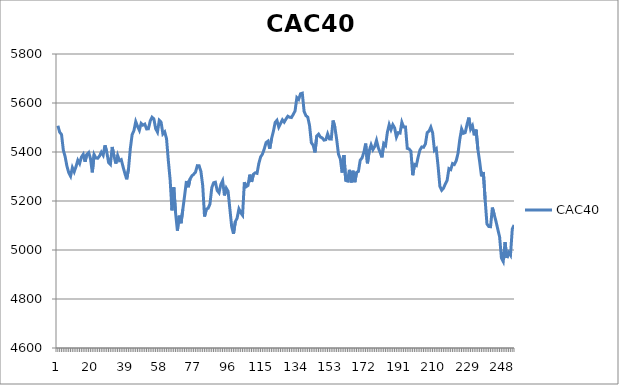
| Category | CAC40 |
|---|---|
| 0 | 5507.25 |
| 1 | 5480.64 |
| 2 | 5471.43 |
| 3 | 5407.75 |
| 4 | 5380.72 |
| 5 | 5341.63 |
| 6 | 5315.58 |
| 7 | 5301.25 |
| 8 | 5336.39 |
| 9 | 5319.17 |
| 10 | 5340.45 |
| 11 | 5366.15 |
| 12 | 5352.76 |
| 13 | 5379.54 |
| 14 | 5390.46 |
| 15 | 5360.09 |
| 16 | 5390.48 |
| 17 | 5398.05 |
| 18 | 5372.79 |
| 19 | 5316.89 |
| 20 | 5389.29 |
| 21 | 5375.53 |
| 22 | 5374.35 |
| 23 | 5383.86 |
| 24 | 5399.09 |
| 25 | 5386.83 |
| 26 | 5427.19 |
| 27 | 5399.45 |
| 28 | 5357.14 |
| 29 | 5349.3 |
| 30 | 5420.58 |
| 31 | 5382.91 |
| 32 | 5352.77 |
| 33 | 5385.97 |
| 34 | 5364.72 |
| 35 | 5368.84 |
| 36 | 5339.42 |
| 37 | 5312.56 |
| 38 | 5288.6 |
| 39 | 5331.28 |
| 40 | 5413.69 |
| 41 | 5470.75 |
| 42 | 5487.42 |
| 43 | 5523.94 |
| 44 | 5504.68 |
| 45 | 5488.55 |
| 46 | 5517.06 |
| 47 | 5509.69 |
| 48 | 5513.82 |
| 49 | 5493.99 |
| 50 | 5494.83 |
| 51 | 5526.51 |
| 52 | 5541.99 |
| 53 | 5535.26 |
| 54 | 5495.16 |
| 55 | 5481.21 |
| 56 | 5529.15 |
| 57 | 5521.59 |
| 58 | 5473.78 |
| 59 | 5481.93 |
| 60 | 5454.55 |
| 61 | 5364.98 |
| 62 | 5285.83 |
| 63 | 5161.81 |
| 64 | 5255.9 |
| 65 | 5151.68 |
| 66 | 5079.21 |
| 67 | 5140.06 |
| 68 | 5109.24 |
| 69 | 5165.26 |
| 70 | 5222.52 |
| 71 | 5281.58 |
| 72 | 5256.18 |
| 73 | 5289.86 |
| 74 | 5302.17 |
| 75 | 5309.23 |
| 76 | 5317.37 |
| 77 | 5344.26 |
| 78 | 5343.93 |
| 79 | 5320.49 |
| 80 | 5262.56 |
| 81 | 5136.58 |
| 82 | 5167.23 |
| 83 | 5170.23 |
| 84 | 5187.83 |
| 85 | 5254.1 |
| 86 | 5274.4 |
| 87 | 5276.71 |
| 88 | 5242.79 |
| 89 | 5233.36 |
| 90 | 5267.26 |
| 91 | 5282.75 |
| 92 | 5222.84 |
| 93 | 5252.43 |
| 94 | 5239.74 |
| 95 | 5167.21 |
| 96 | 5095.22 |
| 97 | 5066.28 |
| 98 | 5115.74 |
| 99 | 5130.44 |
| 100 | 5167.3 |
| 101 | 5152.12 |
| 102 | 5141.8 |
| 103 | 5276.67 |
| 104 | 5258.24 |
| 105 | 5263.39 |
| 106 | 5307.56 |
| 107 | 5277.94 |
| 108 | 5309.22 |
| 109 | 5315.02 |
| 110 | 5312.96 |
| 111 | 5353.54 |
| 112 | 5380.17 |
| 113 | 5391.64 |
| 114 | 5412.83 |
| 115 | 5438.55 |
| 116 | 5444.16 |
| 117 | 5413.3 |
| 118 | 5453.58 |
| 119 | 5483.19 |
| 120 | 5520.5 |
| 121 | 5529.22 |
| 122 | 5501.66 |
| 123 | 5516.05 |
| 124 | 5531.42 |
| 125 | 5521.93 |
| 126 | 5534.63 |
| 127 | 5545.95 |
| 128 | 5541.94 |
| 129 | 5540.68 |
| 130 | 5553.16 |
| 131 | 5567.54 |
| 132 | 5621.92 |
| 133 | 5614.51 |
| 134 | 5637.51 |
| 135 | 5640.1 |
| 136 | 5565.85 |
| 137 | 5548.45 |
| 138 | 5542.55 |
| 139 | 5508.93 |
| 140 | 5438.06 |
| 141 | 5427.35 |
| 142 | 5398.4 |
| 143 | 5465.53 |
| 144 | 5472.91 |
| 145 | 5460.95 |
| 146 | 5457.56 |
| 147 | 5448.36 |
| 148 | 5450.22 |
| 149 | 5473.91 |
| 150 | 5453.37 |
| 151 | 5452.73 |
| 152 | 5528.46 |
| 153 | 5501.88 |
| 154 | 5450.48 |
| 155 | 5390.63 |
| 156 | 5372.31 |
| 157 | 5316.01 |
| 158 | 5387.38 |
| 159 | 5283.86 |
| 160 | 5281.29 |
| 161 | 5327.2 |
| 162 | 5275.64 |
| 163 | 5323.53 |
| 164 | 5276.76 |
| 165 | 5316.77 |
| 166 | 5320.5 |
| 167 | 5366.32 |
| 168 | 5375.77 |
| 169 | 5398.11 |
| 170 | 5434.36 |
| 171 | 5353.93 |
| 172 | 5405.9 |
| 173 | 5429.2 |
| 174 | 5409.43 |
| 175 | 5422.54 |
| 176 | 5447.44 |
| 177 | 5417.07 |
| 178 | 5398.32 |
| 179 | 5378.25 |
| 180 | 5434.19 |
| 181 | 5426.41 |
| 182 | 5480.55 |
| 183 | 5511.76 |
| 184 | 5491.22 |
| 185 | 5511.3 |
| 186 | 5498.37 |
| 187 | 5460.98 |
| 188 | 5478.98 |
| 189 | 5477.18 |
| 190 | 5521.31 |
| 191 | 5501.9 |
| 192 | 5502.25 |
| 193 | 5414.68 |
| 194 | 5412.32 |
| 195 | 5403.41 |
| 196 | 5305.22 |
| 197 | 5349.02 |
| 198 | 5344.93 |
| 199 | 5379.65 |
| 200 | 5408.6 |
| 201 | 5420.61 |
| 202 | 5419.33 |
| 203 | 5432.5 |
| 204 | 5479.1 |
| 205 | 5484.99 |
| 206 | 5501.33 |
| 207 | 5478.06 |
| 208 | 5406.85 |
| 209 | 5413.8 |
| 210 | 5342.7 |
| 211 | 5260.22 |
| 212 | 5243.84 |
| 213 | 5252.22 |
| 214 | 5269.63 |
| 215 | 5283.79 |
| 216 | 5332.13 |
| 217 | 5328.12 |
| 218 | 5352.57 |
| 219 | 5348.87 |
| 220 | 5363.79 |
| 221 | 5393.74 |
| 222 | 5451.59 |
| 223 | 5494.17 |
| 224 | 5476.17 |
| 225 | 5479.1 |
| 226 | 5512.73 |
| 227 | 5540.41 |
| 228 | 5493.49 |
| 229 | 5506.82 |
| 230 | 5467.89 |
| 231 | 5491.4 |
| 232 | 5410.85 |
| 233 | 5359.36 |
| 234 | 5300.25 |
| 235 | 5318.55 |
| 236 | 5206.22 |
| 237 | 5106.37 |
| 238 | 5095.98 |
| 239 | 5095.07 |
| 240 | 5173.05 |
| 241 | 5144.95 |
| 242 | 5116.79 |
| 243 | 5084.66 |
| 244 | 5053.31 |
| 245 | 4967.69 |
| 246 | 4953.09 |
| 247 | 5032.3 |
| 248 | 4967.37 |
| 249 | 4989.35 |
| 250 | 4978.53 |
| 251 | 5085.78 |
| 252 | 5102.13 |